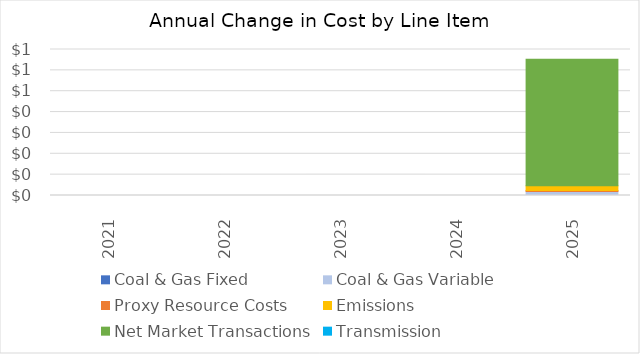
| Category | Coal & Gas Fixed | Coal & Gas Variable | Proxy Resource Costs | Emissions | Net Market Transactions | Transmission |
|---|---|---|---|---|---|---|
| 2021.0 | 0 | 0 | 0 | 0 | 0 | 0 |
| 2022.0 | 0 | 0 | 0 | 0 | 0 | 0 |
| 2023.0 | 0 | 0 | 0 | 0 | 0 | 0 |
| 2024.0 | 0 | 0 | 0 | 0 | 0 | 0 |
| 2025.0 | 0 | 0.019 | 0.005 | 0.023 | 0.606 | 0 |